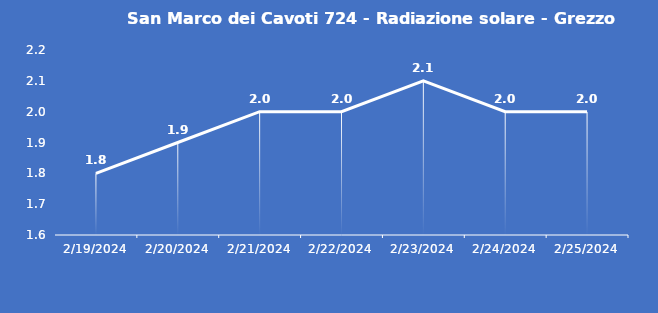
| Category | San Marco dei Cavoti 724 - Radiazione solare - Grezzo (W/m2) |
|---|---|
| 2/19/24 | 1.8 |
| 2/20/24 | 1.9 |
| 2/21/24 | 2 |
| 2/22/24 | 2 |
| 2/23/24 | 2.1 |
| 2/24/24 | 2 |
| 2/25/24 | 2 |